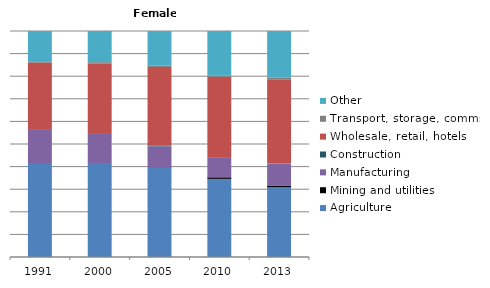
| Category | Agriculture | Mining and utilities | Manufacturing | Construction | Wholesale, retail, hotels | Transport, storage, comms | Other |
|---|---|---|---|---|---|---|---|
| 1991.0 | 41.3 | 0.2 | 14.9 | 0.3 | 29.5 | 0.6 | 13.4 |
| 2000.0 | 41.3 | 0.2 | 13 | 0.3 | 30.7 | 0.7 | 13.8 |
| 2005.0 | 39.5 | 0.2 | 9.2 | 0.3 | 34.8 | 0.7 | 15.2 |
| 2010.0 | 34.6 | 0.7 | 8.8 | 0.2 | 35.5 | 0.6 | 19.7 |
| 2013.0 | 31 | 0.7 | 9.5 | 0.2 | 37.4 | 0.7 | 20.7 |